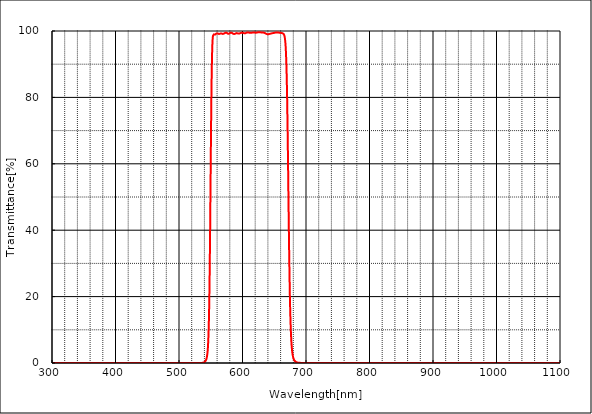
| Category | T% at AOI 0 deg |
|---|---|
| 1100.0 | 0.002 |
| 1099.5 | 0 |
| 1099.0 | 0.001 |
| 1098.5 | 0.002 |
| 1098.0 | 0.001 |
| 1097.5 | 0.001 |
| 1097.0 | 0.002 |
| 1096.5 | 0.001 |
| 1096.0 | 0.002 |
| 1095.5 | 0.003 |
| 1095.0 | 0.002 |
| 1094.5 | 0.002 |
| 1094.0 | 0.001 |
| 1093.5 | 0.002 |
| 1093.0 | 0.002 |
| 1092.5 | 0 |
| 1092.0 | 0.002 |
| 1091.5 | 0.001 |
| 1091.0 | 0.001 |
| 1090.5 | 0.001 |
| 1090.0 | 0.002 |
| 1089.5 | 0 |
| 1089.0 | 0.002 |
| 1088.5 | 0.001 |
| 1088.0 | 0 |
| 1087.5 | 0.001 |
| 1087.0 | 0 |
| 1086.5 | 0 |
| 1086.0 | 0.002 |
| 1085.5 | 0.002 |
| 1085.0 | 0 |
| 1084.5 | -0.001 |
| 1084.0 | 0.001 |
| 1083.5 | 0.001 |
| 1083.0 | 0 |
| 1082.5 | 0.001 |
| 1082.0 | 0 |
| 1081.5 | 0 |
| 1081.0 | 0.001 |
| 1080.5 | -0.001 |
| 1080.0 | 0 |
| 1079.5 | 0.001 |
| 1079.0 | 0 |
| 1078.5 | 0 |
| 1078.0 | 0.001 |
| 1077.5 | 0 |
| 1077.0 | 0 |
| 1076.5 | 0 |
| 1076.0 | -0.001 |
| 1075.5 | 0 |
| 1075.0 | -0.001 |
| 1074.5 | 0 |
| 1074.0 | 0 |
| 1073.5 | 0 |
| 1073.0 | 0.001 |
| 1072.5 | 0.001 |
| 1072.0 | 0.001 |
| 1071.5 | 0 |
| 1071.0 | 0 |
| 1070.5 | 0 |
| 1070.0 | 0.001 |
| 1069.5 | 0.001 |
| 1069.0 | 0 |
| 1068.5 | -0.001 |
| 1068.0 | 0.001 |
| 1067.5 | 0 |
| 1067.0 | 0 |
| 1066.5 | 0.002 |
| 1066.0 | 0 |
| 1065.5 | 0 |
| 1065.0 | -0.001 |
| 1064.5 | 0.001 |
| 1064.0 | 0.001 |
| 1063.5 | 0 |
| 1063.0 | 0 |
| 1062.5 | -0.001 |
| 1062.0 | 0 |
| 1061.5 | 0 |
| 1061.0 | 0 |
| 1060.5 | 0 |
| 1060.0 | 0.001 |
| 1059.5 | -0.001 |
| 1059.0 | -0.001 |
| 1058.5 | 0 |
| 1058.0 | 0 |
| 1057.5 | 0.001 |
| 1057.0 | 0.002 |
| 1056.5 | 0.001 |
| 1056.0 | 0.002 |
| 1055.5 | 0.001 |
| 1055.0 | 0.002 |
| 1054.5 | 0.001 |
| 1054.0 | 0.003 |
| 1053.5 | 0 |
| 1053.0 | 0.001 |
| 1052.5 | 0.002 |
| 1052.0 | -0.001 |
| 1051.5 | 0 |
| 1051.0 | 0 |
| 1050.5 | 0.001 |
| 1050.0 | -0.001 |
| 1049.5 | 0 |
| 1049.0 | 0.001 |
| 1048.5 | 0.001 |
| 1048.0 | 0 |
| 1047.5 | 0 |
| 1047.0 | 0 |
| 1046.5 | 0.001 |
| 1046.0 | 0.001 |
| 1045.5 | 0.001 |
| 1045.0 | 0.001 |
| 1044.5 | 0.001 |
| 1044.0 | 0.001 |
| 1043.5 | 0.001 |
| 1043.0 | 0 |
| 1042.5 | 0 |
| 1042.0 | 0.001 |
| 1041.5 | 0 |
| 1041.0 | 0 |
| 1040.5 | 0 |
| 1040.0 | 0 |
| 1039.5 | 0.001 |
| 1039.0 | 0 |
| 1038.5 | 0 |
| 1038.0 | 0 |
| 1037.5 | -0.001 |
| 1037.0 | 0 |
| 1036.5 | 0.001 |
| 1036.0 | 0 |
| 1035.5 | 0 |
| 1035.0 | -0.001 |
| 1034.5 | -0.001 |
| 1034.0 | 0 |
| 1033.5 | 0 |
| 1033.0 | 0 |
| 1032.5 | 0 |
| 1032.0 | 0 |
| 1031.5 | 0 |
| 1031.0 | 0 |
| 1030.5 | 0 |
| 1030.0 | 0 |
| 1029.5 | 0.001 |
| 1029.0 | -0.001 |
| 1028.5 | 0 |
| 1028.0 | 0.001 |
| 1027.5 | 0.001 |
| 1027.0 | 0 |
| 1026.5 | 0 |
| 1026.0 | 0.001 |
| 1025.5 | 0 |
| 1025.0 | 0 |
| 1024.5 | 0.001 |
| 1024.0 | 0 |
| 1023.5 | 0.001 |
| 1023.0 | 0 |
| 1022.5 | -0.001 |
| 1022.0 | 0.001 |
| 1021.5 | 0 |
| 1021.0 | 0 |
| 1020.5 | -0.001 |
| 1020.0 | 0.001 |
| 1019.5 | 0.001 |
| 1019.0 | 0 |
| 1018.5 | 0 |
| 1018.0 | 0 |
| 1017.5 | 0 |
| 1017.0 | 0.001 |
| 1016.5 | 0.001 |
| 1016.0 | 0 |
| 1015.5 | -0.001 |
| 1015.0 | 0.001 |
| 1014.5 | 0.001 |
| 1014.0 | 0 |
| 1013.5 | 0 |
| 1013.0 | 0.001 |
| 1012.5 | 0 |
| 1012.0 | 0 |
| 1011.5 | 0.001 |
| 1011.0 | 0.001 |
| 1010.5 | -0.001 |
| 1010.0 | 0.001 |
| 1009.5 | 0.001 |
| 1009.0 | -0.001 |
| 1008.5 | 0 |
| 1008.0 | 0 |
| 1007.5 | 0 |
| 1007.0 | 0 |
| 1006.5 | 0.001 |
| 1006.0 | 0 |
| 1005.5 | 0 |
| 1005.0 | 0 |
| 1004.5 | 0.001 |
| 1004.0 | 0 |
| 1003.5 | 0 |
| 1003.0 | 0 |
| 1002.5 | 0 |
| 1002.0 | 0.001 |
| 1001.5 | -0.001 |
| 1001.0 | -0.001 |
| 1000.5 | 0.001 |
| 1000.0 | 0.001 |
| 999.5 | 0.001 |
| 999.0 | 0.001 |
| 998.5 | 0 |
| 998.0 | 0 |
| 997.5 | 0.001 |
| 997.0 | 0 |
| 996.5 | 0.001 |
| 996.0 | 0 |
| 995.5 | 0 |
| 995.0 | 0 |
| 994.5 | 0.001 |
| 994.0 | 0 |
| 993.5 | -0.001 |
| 993.0 | 0 |
| 992.5 | 0 |
| 992.0 | 0.001 |
| 991.5 | 0 |
| 991.0 | 0.001 |
| 990.5 | 0.001 |
| 990.0 | 0.001 |
| 989.5 | 0 |
| 989.0 | 0 |
| 988.5 | 0.001 |
| 988.0 | -0.001 |
| 987.5 | 0.002 |
| 987.0 | 0.002 |
| 986.5 | -0.002 |
| 986.0 | 0 |
| 985.5 | 0 |
| 985.0 | 0 |
| 984.5 | 0 |
| 984.0 | 0 |
| 983.5 | 0.001 |
| 983.0 | 0 |
| 982.5 | 0 |
| 982.0 | 0 |
| 981.5 | 0 |
| 981.0 | -0.001 |
| 980.5 | 0 |
| 980.0 | 0 |
| 979.5 | 0 |
| 979.0 | 0 |
| 978.5 | 0.001 |
| 978.0 | 0 |
| 977.5 | 0 |
| 977.0 | -0.001 |
| 976.5 | -0.001 |
| 976.0 | 0 |
| 975.5 | 0.001 |
| 975.0 | 0.001 |
| 974.5 | 0.001 |
| 974.0 | 0.001 |
| 973.5 | 0 |
| 973.0 | 0.001 |
| 972.5 | 0 |
| 972.0 | 0 |
| 971.5 | 0 |
| 971.0 | -0.001 |
| 970.5 | 0 |
| 970.0 | 0 |
| 969.5 | 0 |
| 969.0 | 0.002 |
| 968.5 | 0 |
| 968.0 | 0 |
| 967.5 | -0.001 |
| 967.0 | 0 |
| 966.5 | 0.001 |
| 966.0 | 0 |
| 965.5 | 0 |
| 965.0 | 0 |
| 964.5 | 0 |
| 964.0 | 0.002 |
| 963.5 | -0.001 |
| 963.0 | -0.001 |
| 962.5 | 0 |
| 962.0 | 0.001 |
| 961.5 | 0 |
| 961.0 | 0.001 |
| 960.5 | 0 |
| 960.0 | 0.002 |
| 959.5 | 0 |
| 959.0 | 0.002 |
| 958.5 | 0 |
| 958.0 | 0 |
| 957.5 | 0 |
| 957.0 | 0 |
| 956.5 | -0.001 |
| 956.0 | 0 |
| 955.5 | 0 |
| 955.0 | -0.001 |
| 954.5 | -0.001 |
| 954.0 | 0.001 |
| 953.5 | 0 |
| 953.0 | 0.002 |
| 952.5 | 0 |
| 952.0 | 0 |
| 951.5 | 0 |
| 951.0 | 0 |
| 950.5 | 0 |
| 950.0 | 0 |
| 949.5 | -0.001 |
| 949.0 | 0.001 |
| 948.5 | 0 |
| 948.0 | 0.001 |
| 947.5 | 0 |
| 947.0 | 0 |
| 946.5 | -0.001 |
| 946.0 | 0.001 |
| 945.5 | 0 |
| 945.0 | -0.001 |
| 944.5 | -0.001 |
| 944.0 | -0.001 |
| 943.5 | 0 |
| 943.0 | 0 |
| 942.5 | 0.001 |
| 942.0 | 0.001 |
| 941.5 | -0.001 |
| 941.0 | -0.001 |
| 940.5 | 0 |
| 940.0 | 0.002 |
| 939.5 | 0.001 |
| 939.0 | 0 |
| 938.5 | 0.001 |
| 938.0 | 0.002 |
| 937.5 | 0.001 |
| 937.0 | 0.001 |
| 936.5 | 0.001 |
| 936.0 | 0 |
| 935.5 | 0 |
| 935.0 | -0.001 |
| 934.5 | 0.001 |
| 934.0 | 0 |
| 933.5 | 0 |
| 933.0 | -0.001 |
| 932.5 | 0.001 |
| 932.0 | 0 |
| 931.5 | -0.001 |
| 931.0 | 0 |
| 930.5 | 0.002 |
| 930.0 | 0.001 |
| 929.5 | 0 |
| 929.0 | 0.001 |
| 928.5 | 0 |
| 928.0 | 0.001 |
| 927.5 | 0 |
| 927.0 | 0 |
| 926.5 | 0 |
| 926.0 | -0.001 |
| 925.5 | 0 |
| 925.0 | 0.001 |
| 924.5 | 0.001 |
| 924.0 | 0.001 |
| 923.5 | 0.001 |
| 923.0 | 0 |
| 922.5 | 0 |
| 922.0 | 0.001 |
| 921.5 | 0 |
| 921.0 | 0.001 |
| 920.5 | 0 |
| 920.0 | 0 |
| 919.5 | -0.001 |
| 919.0 | 0.001 |
| 918.5 | 0 |
| 918.0 | 0.001 |
| 917.5 | 0.001 |
| 917.0 | 0.001 |
| 916.5 | 0.001 |
| 916.0 | 0.002 |
| 915.5 | 0.001 |
| 915.0 | 0 |
| 914.5 | 0 |
| 914.0 | 0 |
| 913.5 | 0.001 |
| 913.0 | 0.001 |
| 912.5 | 0.001 |
| 912.0 | 0.001 |
| 911.5 | 0.001 |
| 911.0 | 0.002 |
| 910.5 | 0 |
| 910.0 | 0 |
| 909.5 | 0 |
| 909.0 | 0 |
| 908.5 | 0.001 |
| 908.0 | 0 |
| 907.5 | 0.002 |
| 907.0 | 0 |
| 906.5 | 0.001 |
| 906.0 | 0.001 |
| 905.5 | 0 |
| 905.0 | 0 |
| 904.5 | 0.001 |
| 904.0 | 0 |
| 903.5 | 0 |
| 903.0 | 0.001 |
| 902.5 | 0 |
| 902.0 | 0.001 |
| 901.5 | 0 |
| 901.0 | 0 |
| 900.5 | 0 |
| 900.0 | -0.001 |
| 899.5 | -0.001 |
| 899.0 | 0 |
| 898.5 | 0.001 |
| 898.0 | 0 |
| 897.5 | 0 |
| 897.0 | 0.001 |
| 896.5 | 0.001 |
| 896.0 | 0 |
| 895.5 | 0 |
| 895.0 | 0 |
| 894.5 | 0 |
| 894.0 | -0.001 |
| 893.5 | 0 |
| 893.0 | 0 |
| 892.5 | 0.001 |
| 892.0 | 0.002 |
| 891.5 | -0.001 |
| 891.0 | 0.001 |
| 890.5 | 0 |
| 890.0 | -0.001 |
| 889.5 | 0 |
| 889.0 | 0.001 |
| 888.5 | 0 |
| 888.0 | 0.002 |
| 887.5 | 0 |
| 887.0 | 0 |
| 886.5 | 0 |
| 886.0 | 0.002 |
| 885.5 | 0 |
| 885.0 | 0 |
| 884.5 | 0 |
| 884.0 | 0.001 |
| 883.5 | 0.001 |
| 883.0 | -0.001 |
| 882.5 | 0 |
| 882.0 | 0 |
| 881.5 | 0 |
| 881.0 | 0 |
| 880.5 | 0 |
| 880.0 | 0.002 |
| 879.5 | -0.001 |
| 879.0 | 0 |
| 878.5 | 0.001 |
| 878.0 | 0 |
| 877.5 | 0 |
| 877.0 | 0 |
| 876.5 | -0.001 |
| 876.0 | -0.001 |
| 875.5 | 0.001 |
| 875.0 | 0.001 |
| 874.5 | 0 |
| 874.0 | 0 |
| 873.5 | -0.001 |
| 873.0 | 0 |
| 872.5 | 0 |
| 872.0 | 0.001 |
| 871.5 | 0 |
| 871.0 | 0.001 |
| 870.5 | 0 |
| 870.0 | 0 |
| 869.5 | 0 |
| 869.0 | -0.002 |
| 868.5 | -0.001 |
| 868.0 | -0.001 |
| 867.5 | 0 |
| 867.0 | 0 |
| 866.5 | 0 |
| 866.0 | 0 |
| 865.5 | 0 |
| 865.0 | 0 |
| 864.5 | 0.001 |
| 864.0 | 0.001 |
| 863.5 | 0.001 |
| 863.0 | 0 |
| 862.5 | 0 |
| 862.0 | -0.001 |
| 861.5 | 0 |
| 861.0 | 0 |
| 860.5 | 0 |
| 860.0 | 0 |
| 859.5 | 0 |
| 859.0 | 0.001 |
| 858.5 | 0 |
| 858.0 | 0.001 |
| 857.5 | -0.001 |
| 857.0 | 0 |
| 856.5 | 0.001 |
| 856.0 | 0 |
| 855.5 | 0 |
| 855.0 | 0 |
| 854.5 | -0.001 |
| 854.0 | -0.001 |
| 853.5 | 0.001 |
| 853.0 | 0 |
| 852.5 | 0.001 |
| 852.0 | 0.001 |
| 851.5 | 0 |
| 851.0 | 0.001 |
| 850.5 | -0.001 |
| 850.0 | 0.001 |
| 849.5 | 0 |
| 849.0 | 0 |
| 848.5 | 0.001 |
| 848.0 | 0 |
| 847.5 | 0 |
| 847.0 | 0 |
| 846.5 | 0 |
| 846.0 | 0 |
| 845.5 | 0 |
| 845.0 | 0 |
| 844.5 | 0 |
| 844.0 | 0 |
| 843.5 | 0 |
| 843.0 | 0 |
| 842.5 | 0 |
| 842.0 | 0 |
| 841.5 | 0 |
| 841.0 | 0 |
| 840.5 | 0 |
| 840.0 | 0 |
| 839.5 | 0 |
| 839.0 | 0 |
| 838.5 | 0 |
| 838.0 | 0 |
| 837.5 | 0 |
| 837.0 | 0 |
| 836.5 | 0 |
| 836.0 | 0 |
| 835.5 | 0 |
| 835.0 | 0 |
| 834.5 | 0 |
| 834.0 | 0 |
| 833.5 | 0 |
| 833.0 | 0 |
| 832.5 | -0.001 |
| 832.0 | 0 |
| 831.5 | 0 |
| 831.0 | 0 |
| 830.5 | 0 |
| 830.0 | 0 |
| 829.5 | 0 |
| 829.0 | 0 |
| 828.5 | 0 |
| 828.0 | 0 |
| 827.5 | 0 |
| 827.0 | 0 |
| 826.5 | 0 |
| 826.0 | 0 |
| 825.5 | 0.001 |
| 825.0 | 0 |
| 824.5 | 0 |
| 824.0 | 0 |
| 823.5 | 0 |
| 823.0 | 0 |
| 822.5 | 0 |
| 822.0 | 0 |
| 821.5 | 0 |
| 821.0 | 0 |
| 820.5 | 0 |
| 820.0 | 0 |
| 819.5 | 0 |
| 819.0 | 0 |
| 818.5 | 0 |
| 818.0 | 0 |
| 817.5 | 0 |
| 817.0 | 0 |
| 816.5 | 0 |
| 816.0 | 0 |
| 815.5 | 0 |
| 815.0 | 0 |
| 814.5 | 0 |
| 814.0 | 0 |
| 813.5 | 0 |
| 813.0 | 0 |
| 812.5 | 0 |
| 812.0 | 0 |
| 811.5 | 0 |
| 811.0 | 0 |
| 810.5 | 0 |
| 810.0 | 0 |
| 809.5 | 0 |
| 809.0 | -0.001 |
| 808.5 | 0 |
| 808.0 | 0 |
| 807.5 | 0 |
| 807.0 | 0 |
| 806.5 | 0 |
| 806.0 | 0 |
| 805.5 | 0 |
| 805.0 | 0 |
| 804.5 | 0 |
| 804.0 | 0 |
| 803.5 | 0 |
| 803.0 | 0 |
| 802.5 | 0 |
| 802.0 | 0 |
| 801.5 | 0 |
| 801.0 | 0 |
| 800.5 | 0 |
| 800.0 | 0 |
| 799.5 | 0 |
| 799.0 | 0 |
| 798.5 | 0 |
| 798.0 | 0 |
| 797.5 | 0 |
| 797.0 | 0 |
| 796.5 | 0 |
| 796.0 | 0 |
| 795.5 | 0 |
| 795.0 | 0 |
| 794.5 | 0 |
| 794.0 | 0 |
| 793.5 | 0 |
| 793.0 | 0 |
| 792.5 | 0 |
| 792.0 | 0 |
| 791.5 | 0 |
| 791.0 | 0 |
| 790.5 | 0 |
| 790.0 | 0 |
| 789.5 | 0 |
| 789.0 | 0 |
| 788.5 | 0 |
| 788.0 | 0 |
| 787.5 | 0 |
| 787.0 | 0 |
| 786.5 | 0 |
| 786.0 | 0 |
| 785.5 | 0 |
| 785.0 | 0 |
| 784.5 | 0 |
| 784.0 | 0 |
| 783.5 | 0 |
| 783.0 | 0 |
| 782.5 | 0 |
| 782.0 | 0.001 |
| 781.5 | 0 |
| 781.0 | 0 |
| 780.5 | 0 |
| 780.0 | 0 |
| 779.5 | 0 |
| 779.0 | 0 |
| 778.5 | 0 |
| 778.0 | 0 |
| 777.5 | 0 |
| 777.0 | 0 |
| 776.5 | 0 |
| 776.0 | 0 |
| 775.5 | 0 |
| 775.0 | 0 |
| 774.5 | 0 |
| 774.0 | 0 |
| 773.5 | 0 |
| 773.0 | 0 |
| 772.5 | 0 |
| 772.0 | 0 |
| 771.5 | 0 |
| 771.0 | 0 |
| 770.5 | 0 |
| 770.0 | 0 |
| 769.5 | 0 |
| 769.0 | 0 |
| 768.5 | 0 |
| 768.0 | 0 |
| 767.5 | 0 |
| 767.0 | 0 |
| 766.5 | 0 |
| 766.0 | 0 |
| 765.5 | 0 |
| 765.0 | 0 |
| 764.5 | 0 |
| 764.0 | 0 |
| 763.5 | 0 |
| 763.0 | 0 |
| 762.5 | 0 |
| 762.0 | 0 |
| 761.5 | 0 |
| 761.0 | 0 |
| 760.5 | 0 |
| 760.0 | 0 |
| 759.5 | 0 |
| 759.0 | 0 |
| 758.5 | 0 |
| 758.0 | 0 |
| 757.5 | 0 |
| 757.0 | 0 |
| 756.5 | 0 |
| 756.0 | 0 |
| 755.5 | 0 |
| 755.0 | 0 |
| 754.5 | 0 |
| 754.0 | 0 |
| 753.5 | 0 |
| 753.0 | 0 |
| 752.5 | 0 |
| 752.0 | 0 |
| 751.5 | 0 |
| 751.0 | 0 |
| 750.5 | 0 |
| 750.0 | 0 |
| 749.5 | 0 |
| 749.0 | 0 |
| 748.5 | 0 |
| 748.0 | 0 |
| 747.5 | 0 |
| 747.0 | 0 |
| 746.5 | 0 |
| 746.0 | 0 |
| 745.5 | 0 |
| 745.0 | 0 |
| 744.5 | 0 |
| 744.0 | 0 |
| 743.5 | 0 |
| 743.0 | 0 |
| 742.5 | 0 |
| 742.0 | 0 |
| 741.5 | 0 |
| 741.0 | 0 |
| 740.5 | 0 |
| 740.0 | 0 |
| 739.5 | 0 |
| 739.0 | 0 |
| 738.5 | 0 |
| 738.0 | 0 |
| 737.5 | 0 |
| 737.0 | 0 |
| 736.5 | 0 |
| 736.0 | 0 |
| 735.5 | 0 |
| 735.0 | 0 |
| 734.5 | 0 |
| 734.0 | 0 |
| 733.5 | 0 |
| 733.0 | 0 |
| 732.5 | 0 |
| 732.0 | 0 |
| 731.5 | 0 |
| 731.0 | 0 |
| 730.5 | 0 |
| 730.0 | 0 |
| 729.5 | 0 |
| 729.0 | 0 |
| 728.5 | 0 |
| 728.0 | 0 |
| 727.5 | 0 |
| 727.0 | 0 |
| 726.5 | 0 |
| 726.0 | 0 |
| 725.5 | 0 |
| 725.0 | 0 |
| 724.5 | 0 |
| 724.0 | 0 |
| 723.5 | 0 |
| 723.0 | 0 |
| 722.5 | 0 |
| 722.0 | 0 |
| 721.5 | 0 |
| 721.0 | 0 |
| 720.5 | 0 |
| 720.0 | 0 |
| 719.5 | 0 |
| 719.0 | 0 |
| 718.5 | 0 |
| 718.0 | 0 |
| 717.5 | 0 |
| 717.0 | 0 |
| 716.5 | 0 |
| 716.0 | 0 |
| 715.5 | 0 |
| 715.0 | 0 |
| 714.5 | 0 |
| 714.0 | 0 |
| 713.5 | 0 |
| 713.0 | 0 |
| 712.5 | 0 |
| 712.0 | 0 |
| 711.5 | 0 |
| 711.0 | 0.001 |
| 710.5 | 0.001 |
| 710.0 | 0 |
| 709.5 | 0.001 |
| 709.0 | 0.001 |
| 708.5 | 0 |
| 708.0 | 0.001 |
| 707.5 | 0.001 |
| 707.0 | 0.001 |
| 706.5 | 0.001 |
| 706.0 | 0.001 |
| 705.5 | 0.002 |
| 705.0 | 0.001 |
| 704.5 | 0.002 |
| 704.0 | 0.002 |
| 703.5 | 0.002 |
| 703.0 | 0.002 |
| 702.5 | 0.003 |
| 702.0 | 0.003 |
| 701.5 | 0.003 |
| 701.0 | 0.003 |
| 700.5 | 0.004 |
| 700.0 | 0.004 |
| 699.5 | 0.005 |
| 699.0 | 0.006 |
| 698.5 | 0.006 |
| 698.0 | 0.007 |
| 697.5 | 0.008 |
| 697.0 | 0.009 |
| 696.5 | 0.01 |
| 696.0 | 0.011 |
| 695.5 | 0.012 |
| 695.0 | 0.014 |
| 694.5 | 0.016 |
| 694.0 | 0.018 |
| 693.5 | 0.02 |
| 693.0 | 0.023 |
| 692.5 | 0.026 |
| 692.0 | 0.029 |
| 691.5 | 0.034 |
| 691.0 | 0.038 |
| 690.5 | 0.044 |
| 690.0 | 0.05 |
| 689.5 | 0.058 |
| 689.0 | 0.066 |
| 688.5 | 0.076 |
| 688.0 | 0.089 |
| 687.5 | 0.102 |
| 687.0 | 0.12 |
| 686.5 | 0.139 |
| 686.0 | 0.164 |
| 685.5 | 0.193 |
| 685.0 | 0.228 |
| 684.5 | 0.27 |
| 684.0 | 0.321 |
| 683.5 | 0.386 |
| 683.0 | 0.463 |
| 682.5 | 0.558 |
| 682.0 | 0.681 |
| 681.5 | 0.829 |
| 681.0 | 1.016 |
| 680.5 | 1.256 |
| 680.0 | 1.557 |
| 679.5 | 1.942 |
| 679.0 | 2.435 |
| 678.5 | 3.072 |
| 678.0 | 3.89 |
| 677.5 | 4.945 |
| 677.0 | 6.321 |
| 676.5 | 8.079 |
| 676.0 | 10.327 |
| 675.5 | 13.276 |
| 675.0 | 16.861 |
| 674.5 | 21.288 |
| 674.0 | 26.765 |
| 673.5 | 33.029 |
| 673.0 | 40.066 |
| 672.5 | 47.777 |
| 672.0 | 55.711 |
| 671.5 | 63.404 |
| 671.0 | 70.695 |
| 670.5 | 77.181 |
| 670.0 | 82.684 |
| 669.5 | 87.153 |
| 669.0 | 90.662 |
| 668.5 | 93.273 |
| 668.0 | 95.164 |
| 667.5 | 96.547 |
| 667.0 | 97.479 |
| 666.5 | 98.143 |
| 666.0 | 98.588 |
| 665.5 | 98.85 |
| 665.0 | 99.045 |
| 664.5 | 99.171 |
| 664.0 | 99.259 |
| 663.5 | 99.304 |
| 663.0 | 99.346 |
| 662.5 | 99.37 |
| 662.0 | 99.387 |
| 661.5 | 99.396 |
| 661.0 | 99.415 |
| 660.5 | 99.428 |
| 660.0 | 99.424 |
| 659.5 | 99.445 |
| 659.0 | 99.455 |
| 658.5 | 99.468 |
| 658.0 | 99.482 |
| 657.5 | 99.489 |
| 657.0 | 99.513 |
| 656.5 | 99.515 |
| 656.0 | 99.535 |
| 655.5 | 99.546 |
| 655.0 | 99.551 |
| 654.5 | 99.543 |
| 654.0 | 99.548 |
| 653.5 | 99.555 |
| 653.0 | 99.549 |
| 652.5 | 99.539 |
| 652.0 | 99.53 |
| 651.5 | 99.51 |
| 651.0 | 99.493 |
| 650.5 | 99.482 |
| 650.0 | 99.442 |
| 649.5 | 99.431 |
| 649.0 | 99.406 |
| 648.5 | 99.373 |
| 648.0 | 99.364 |
| 647.5 | 99.334 |
| 647.0 | 99.337 |
| 646.5 | 99.291 |
| 646.0 | 99.28 |
| 645.5 | 99.276 |
| 645.0 | 99.245 |
| 644.5 | 99.229 |
| 644.0 | 99.2 |
| 643.5 | 99.182 |
| 643.0 | 99.156 |
| 642.5 | 99.121 |
| 642.0 | 99.1 |
| 641.5 | 99.064 |
| 641.0 | 99.043 |
| 640.5 | 99.036 |
| 640.0 | 99.038 |
| 639.5 | 99.029 |
| 639.0 | 99.047 |
| 638.5 | 99.071 |
| 638.0 | 99.091 |
| 637.5 | 99.132 |
| 637.0 | 99.189 |
| 636.5 | 99.234 |
| 636.0 | 99.296 |
| 635.5 | 99.337 |
| 635.0 | 99.398 |
| 634.5 | 99.419 |
| 634.0 | 99.466 |
| 633.5 | 99.502 |
| 633.0 | 99.527 |
| 632.5 | 99.541 |
| 632.0 | 99.55 |
| 631.5 | 99.547 |
| 631.0 | 99.554 |
| 630.5 | 99.561 |
| 630.0 | 99.557 |
| 629.5 | 99.577 |
| 629.0 | 99.578 |
| 628.5 | 99.573 |
| 628.0 | 99.594 |
| 627.5 | 99.596 |
| 627.0 | 99.619 |
| 626.5 | 99.612 |
| 626.0 | 99.632 |
| 625.5 | 99.633 |
| 625.0 | 99.642 |
| 624.5 | 99.621 |
| 624.0 | 99.606 |
| 623.5 | 99.568 |
| 623.0 | 99.549 |
| 622.5 | 99.527 |
| 622.0 | 99.528 |
| 621.5 | 99.507 |
| 621.0 | 99.474 |
| 620.5 | 99.48 |
| 620.0 | 99.488 |
| 619.5 | 99.518 |
| 619.0 | 99.526 |
| 618.5 | 99.505 |
| 618.0 | 99.521 |
| 617.5 | 99.551 |
| 617.0 | 99.54 |
| 616.5 | 99.539 |
| 616.0 | 99.53 |
| 615.5 | 99.522 |
| 615.0 | 99.503 |
| 614.5 | 99.49 |
| 614.0 | 99.474 |
| 613.5 | 99.48 |
| 613.0 | 99.462 |
| 612.5 | 99.444 |
| 612.0 | 99.457 |
| 611.5 | 99.458 |
| 611.0 | 99.489 |
| 610.5 | 99.545 |
| 610.0 | 99.589 |
| 609.5 | 99.581 |
| 609.0 | 99.576 |
| 608.5 | 99.601 |
| 608.0 | 99.595 |
| 607.5 | 99.574 |
| 607.0 | 99.554 |
| 606.5 | 99.498 |
| 606.0 | 99.469 |
| 605.5 | 99.424 |
| 605.0 | 99.366 |
| 604.5 | 99.335 |
| 604.0 | 99.301 |
| 603.5 | 99.3 |
| 603.0 | 99.294 |
| 602.5 | 99.318 |
| 602.0 | 99.349 |
| 601.5 | 99.384 |
| 601.0 | 99.438 |
| 600.5 | 99.466 |
| 600.0 | 99.496 |
| 599.5 | 99.516 |
| 599.0 | 99.514 |
| 598.5 | 99.5 |
| 598.0 | 99.467 |
| 597.5 | 99.429 |
| 597.0 | 99.38 |
| 596.5 | 99.33 |
| 596.0 | 99.262 |
| 595.5 | 99.233 |
| 595.0 | 99.233 |
| 594.5 | 99.216 |
| 594.0 | 99.198 |
| 593.5 | 99.205 |
| 593.0 | 99.247 |
| 592.5 | 99.276 |
| 592.0 | 99.351 |
| 591.5 | 99.363 |
| 591.0 | 99.37 |
| 590.5 | 99.357 |
| 590.0 | 99.348 |
| 589.5 | 99.297 |
| 589.0 | 99.248 |
| 588.5 | 99.221 |
| 588.0 | 99.16 |
| 587.5 | 99.099 |
| 587.0 | 99.083 |
| 586.5 | 99.106 |
| 586.0 | 99.113 |
| 585.5 | 99.13 |
| 585.0 | 99.197 |
| 584.5 | 99.267 |
| 584.0 | 99.343 |
| 583.5 | 99.409 |
| 583.0 | 99.473 |
| 582.5 | 99.519 |
| 582.0 | 99.518 |
| 581.5 | 99.513 |
| 581.0 | 99.469 |
| 580.5 | 99.436 |
| 580.0 | 99.362 |
| 579.5 | 99.276 |
| 579.0 | 99.206 |
| 578.5 | 99.173 |
| 578.0 | 99.155 |
| 577.5 | 99.156 |
| 577.0 | 99.189 |
| 576.5 | 99.239 |
| 576.0 | 99.288 |
| 575.5 | 99.384 |
| 575.0 | 99.463 |
| 574.5 | 99.473 |
| 574.0 | 99.49 |
| 573.5 | 99.479 |
| 573.0 | 99.449 |
| 572.5 | 99.412 |
| 572.0 | 99.361 |
| 571.5 | 99.287 |
| 571.0 | 99.239 |
| 570.5 | 99.173 |
| 570.0 | 99.154 |
| 569.5 | 99.118 |
| 569.0 | 99.124 |
| 568.5 | 99.145 |
| 568.0 | 99.179 |
| 567.5 | 99.218 |
| 567.0 | 99.236 |
| 566.5 | 99.251 |
| 566.0 | 99.255 |
| 565.5 | 99.239 |
| 565.0 | 99.221 |
| 564.5 | 99.178 |
| 564.0 | 99.14 |
| 563.5 | 99.127 |
| 563.0 | 99.105 |
| 562.5 | 99.129 |
| 562.0 | 99.144 |
| 561.5 | 99.183 |
| 561.0 | 99.251 |
| 560.5 | 99.273 |
| 560.0 | 99.308 |
| 559.5 | 99.301 |
| 559.0 | 99.257 |
| 558.5 | 99.21 |
| 558.0 | 99.125 |
| 557.5 | 99.024 |
| 557.0 | 98.945 |
| 556.5 | 98.887 |
| 556.0 | 98.879 |
| 555.5 | 98.914 |
| 555.0 | 98.981 |
| 554.5 | 99.028 |
| 554.0 | 98.957 |
| 553.5 | 98.578 |
| 553.0 | 97.606 |
| 552.5 | 95.722 |
| 552.0 | 92.429 |
| 551.5 | 87.213 |
| 551.0 | 80.162 |
| 550.5 | 71.219 |
| 550.0 | 60.915 |
| 549.5 | 50.179 |
| 549.0 | 39.731 |
| 548.5 | 30.509 |
| 548.0 | 22.743 |
| 547.5 | 16.677 |
| 547.0 | 12.122 |
| 546.5 | 8.715 |
| 546.0 | 6.32 |
| 545.5 | 4.628 |
| 545.0 | 3.379 |
| 544.5 | 2.531 |
| 544.0 | 1.91 |
| 543.5 | 1.447 |
| 543.0 | 1.112 |
| 542.5 | 0.861 |
| 542.0 | 0.666 |
| 541.5 | 0.518 |
| 541.0 | 0.404 |
| 540.5 | 0.313 |
| 540.0 | 0.242 |
| 539.5 | 0.187 |
| 539.0 | 0.144 |
| 538.5 | 0.11 |
| 538.0 | 0.084 |
| 537.5 | 0.064 |
| 537.0 | 0.049 |
| 536.5 | 0.038 |
| 536.0 | 0.029 |
| 535.5 | 0.023 |
| 535.0 | 0.017 |
| 534.5 | 0.014 |
| 534.0 | 0.011 |
| 533.5 | 0.009 |
| 533.0 | 0.007 |
| 532.5 | 0.006 |
| 532.0 | 0.005 |
| 531.5 | 0.004 |
| 531.0 | 0.004 |
| 530.5 | 0.003 |
| 530.0 | 0.003 |
| 529.5 | 0.003 |
| 529.0 | 0.002 |
| 528.5 | 0.002 |
| 528.0 | 0.002 |
| 527.5 | 0.002 |
| 527.0 | 0.001 |
| 526.5 | 0.001 |
| 526.0 | 0.001 |
| 525.5 | 0.001 |
| 525.0 | 0.001 |
| 524.5 | 0.001 |
| 524.0 | 0 |
| 523.5 | 0.001 |
| 523.0 | 0 |
| 522.5 | 0 |
| 522.0 | 0 |
| 521.5 | 0 |
| 521.0 | 0 |
| 520.5 | 0 |
| 520.0 | 0 |
| 519.5 | 0 |
| 519.0 | 0 |
| 518.5 | 0 |
| 518.0 | 0 |
| 517.5 | 0 |
| 517.0 | 0 |
| 516.5 | 0 |
| 516.0 | 0 |
| 515.5 | 0 |
| 515.0 | 0 |
| 514.5 | 0 |
| 514.0 | 0 |
| 513.5 | 0 |
| 513.0 | 0 |
| 512.5 | 0 |
| 512.0 | 0 |
| 511.5 | 0 |
| 511.0 | 0 |
| 510.5 | 0 |
| 510.0 | 0 |
| 509.5 | 0 |
| 509.0 | 0 |
| 508.5 | 0 |
| 508.0 | 0 |
| 507.5 | 0 |
| 507.0 | 0 |
| 506.5 | 0 |
| 506.0 | 0 |
| 505.5 | 0 |
| 505.0 | 0 |
| 504.5 | 0 |
| 504.0 | 0 |
| 503.5 | 0 |
| 503.0 | 0 |
| 502.5 | 0 |
| 502.0 | 0 |
| 501.5 | 0 |
| 501.0 | 0 |
| 500.5 | 0 |
| 500.0 | 0 |
| 499.5 | 0 |
| 499.0 | 0 |
| 498.5 | 0 |
| 498.0 | 0 |
| 497.5 | 0 |
| 497.0 | 0 |
| 496.5 | 0 |
| 496.0 | 0 |
| 495.5 | 0 |
| 495.0 | 0 |
| 494.5 | 0 |
| 494.0 | 0 |
| 493.5 | 0 |
| 493.0 | 0 |
| 492.5 | 0 |
| 492.0 | 0 |
| 491.5 | 0 |
| 491.0 | 0 |
| 490.5 | 0 |
| 490.0 | 0 |
| 489.5 | 0 |
| 489.0 | 0 |
| 488.5 | 0 |
| 488.0 | 0 |
| 487.5 | 0 |
| 487.0 | 0 |
| 486.5 | 0 |
| 486.0 | 0 |
| 485.5 | 0 |
| 485.0 | 0 |
| 484.5 | 0 |
| 484.0 | 0 |
| 483.5 | 0 |
| 483.0 | 0 |
| 482.5 | 0 |
| 482.0 | 0 |
| 481.5 | 0 |
| 481.0 | 0 |
| 480.5 | 0 |
| 480.0 | 0 |
| 479.5 | 0 |
| 479.0 | 0 |
| 478.5 | 0 |
| 478.0 | 0 |
| 477.5 | 0 |
| 477.0 | 0 |
| 476.5 | 0 |
| 476.0 | 0 |
| 475.5 | 0 |
| 475.0 | 0 |
| 474.5 | 0 |
| 474.0 | 0 |
| 473.5 | 0 |
| 473.0 | 0 |
| 472.5 | 0 |
| 472.0 | 0 |
| 471.5 | 0 |
| 471.0 | 0 |
| 470.5 | 0 |
| 470.0 | 0 |
| 469.5 | 0 |
| 469.0 | 0 |
| 468.5 | 0 |
| 468.0 | 0 |
| 467.5 | 0 |
| 467.0 | 0 |
| 466.5 | 0 |
| 466.0 | 0 |
| 465.5 | 0 |
| 465.0 | 0 |
| 464.5 | 0 |
| 464.0 | 0 |
| 463.5 | 0 |
| 463.0 | 0 |
| 462.5 | 0 |
| 462.0 | 0 |
| 461.5 | 0 |
| 461.0 | 0 |
| 460.5 | 0 |
| 460.0 | 0 |
| 459.5 | 0 |
| 459.0 | 0 |
| 458.5 | 0 |
| 458.0 | 0 |
| 457.5 | 0 |
| 457.0 | 0 |
| 456.5 | 0 |
| 456.0 | 0 |
| 455.5 | 0 |
| 455.0 | 0 |
| 454.5 | 0 |
| 454.0 | 0 |
| 453.5 | 0 |
| 453.0 | 0 |
| 452.5 | 0 |
| 452.0 | 0 |
| 451.5 | 0 |
| 451.0 | 0 |
| 450.5 | 0 |
| 450.0 | 0 |
| 449.5 | 0 |
| 449.0 | 0 |
| 448.5 | 0 |
| 448.0 | 0 |
| 447.5 | 0 |
| 447.0 | 0 |
| 446.5 | 0 |
| 446.0 | 0 |
| 445.5 | 0 |
| 445.0 | 0 |
| 444.5 | 0 |
| 444.0 | 0 |
| 443.5 | 0 |
| 443.0 | 0 |
| 442.5 | 0 |
| 442.0 | 0 |
| 441.5 | 0 |
| 441.0 | 0 |
| 440.5 | 0 |
| 440.0 | 0 |
| 439.5 | 0 |
| 439.0 | 0 |
| 438.5 | 0 |
| 438.0 | 0 |
| 437.5 | 0 |
| 437.0 | 0 |
| 436.5 | 0 |
| 436.0 | 0 |
| 435.5 | 0 |
| 435.0 | 0 |
| 434.5 | 0 |
| 434.0 | 0 |
| 433.5 | 0 |
| 433.0 | 0 |
| 432.5 | 0 |
| 432.0 | 0 |
| 431.5 | 0 |
| 431.0 | 0 |
| 430.5 | 0 |
| 430.0 | 0 |
| 429.5 | 0 |
| 429.0 | 0 |
| 428.5 | 0 |
| 428.0 | 0 |
| 427.5 | 0 |
| 427.0 | 0 |
| 426.5 | 0 |
| 426.0 | 0 |
| 425.5 | 0 |
| 425.0 | 0 |
| 424.5 | 0 |
| 424.0 | 0 |
| 423.5 | 0 |
| 423.0 | 0 |
| 422.5 | 0 |
| 422.0 | 0 |
| 421.5 | 0 |
| 421.0 | 0 |
| 420.5 | 0 |
| 420.0 | 0 |
| 419.5 | 0 |
| 419.0 | 0 |
| 418.5 | 0 |
| 418.0 | 0 |
| 417.5 | 0 |
| 417.0 | 0 |
| 416.5 | 0 |
| 416.0 | 0 |
| 415.5 | 0 |
| 415.0 | 0 |
| 414.5 | 0 |
| 414.0 | 0 |
| 413.5 | 0 |
| 413.0 | 0 |
| 412.5 | 0 |
| 412.0 | 0 |
| 411.5 | 0 |
| 411.0 | 0 |
| 410.5 | 0 |
| 410.0 | 0 |
| 409.5 | 0 |
| 409.0 | 0 |
| 408.5 | 0 |
| 408.0 | 0 |
| 407.5 | 0 |
| 407.0 | 0 |
| 406.5 | 0 |
| 406.0 | 0 |
| 405.5 | 0 |
| 405.0 | 0 |
| 404.5 | 0 |
| 404.0 | 0 |
| 403.5 | 0 |
| 403.0 | 0 |
| 402.5 | 0 |
| 402.0 | 0 |
| 401.5 | 0 |
| 401.0 | 0 |
| 400.5 | 0 |
| 400.0 | 0 |
| 399.5 | 0 |
| 399.0 | 0 |
| 398.5 | 0 |
| 398.0 | 0 |
| 397.5 | 0 |
| 397.0 | 0 |
| 396.5 | 0 |
| 396.0 | -0.001 |
| 395.5 | 0 |
| 395.0 | 0 |
| 394.5 | 0 |
| 394.0 | 0 |
| 393.5 | 0 |
| 393.0 | 0 |
| 392.5 | 0 |
| 392.0 | 0 |
| 391.5 | 0 |
| 391.0 | 0 |
| 390.5 | 0 |
| 390.0 | 0 |
| 389.5 | 0 |
| 389.0 | 0 |
| 388.5 | 0 |
| 388.0 | 0 |
| 387.5 | 0 |
| 387.0 | 0 |
| 386.5 | 0 |
| 386.0 | 0 |
| 385.5 | 0 |
| 385.0 | 0 |
| 384.5 | 0 |
| 384.0 | 0 |
| 383.5 | 0 |
| 383.0 | 0 |
| 382.5 | 0 |
| 382.0 | 0 |
| 381.5 | 0 |
| 381.0 | 0 |
| 380.5 | 0 |
| 380.0 | 0 |
| 379.5 | 0 |
| 379.0 | 0 |
| 378.5 | 0 |
| 378.0 | 0 |
| 377.5 | 0 |
| 377.0 | 0 |
| 376.5 | 0 |
| 376.0 | 0 |
| 375.5 | 0 |
| 375.0 | 0 |
| 374.5 | 0 |
| 374.0 | 0 |
| 373.5 | 0 |
| 373.0 | 0 |
| 372.5 | 0 |
| 372.0 | 0 |
| 371.5 | 0 |
| 371.0 | 0 |
| 370.5 | 0 |
| 370.0 | 0 |
| 369.5 | 0 |
| 369.0 | 0 |
| 368.5 | 0 |
| 368.0 | 0 |
| 367.5 | 0 |
| 367.0 | 0 |
| 366.5 | 0 |
| 366.0 | 0 |
| 365.5 | 0 |
| 365.0 | 0 |
| 364.5 | 0 |
| 364.0 | 0 |
| 363.5 | 0 |
| 363.0 | 0 |
| 362.5 | 0 |
| 362.0 | 0 |
| 361.5 | 0 |
| 361.0 | 0 |
| 360.5 | 0 |
| 360.0 | 0 |
| 359.5 | 0 |
| 359.0 | 0 |
| 358.5 | 0 |
| 358.0 | 0 |
| 357.5 | 0 |
| 357.0 | 0 |
| 356.5 | 0 |
| 356.0 | 0 |
| 355.5 | 0 |
| 355.0 | 0 |
| 354.5 | 0 |
| 354.0 | 0 |
| 353.5 | 0 |
| 353.0 | 0 |
| 352.5 | 0 |
| 352.0 | 0 |
| 351.5 | 0 |
| 351.0 | 0 |
| 350.5 | 0 |
| 350.0 | 0 |
| 349.5 | 0 |
| 349.0 | 0 |
| 348.5 | 0 |
| 348.0 | 0 |
| 347.5 | 0 |
| 347.0 | 0 |
| 346.5 | 0 |
| 346.0 | 0 |
| 345.5 | 0 |
| 345.0 | 0 |
| 344.5 | 0 |
| 344.0 | 0 |
| 343.5 | 0 |
| 343.0 | 0 |
| 342.5 | 0 |
| 342.0 | 0 |
| 341.5 | 0 |
| 341.0 | 0 |
| 340.5 | 0 |
| 340.0 | 0 |
| 339.5 | 0 |
| 339.0 | 0 |
| 338.5 | 0 |
| 338.0 | 0 |
| 337.5 | 0 |
| 337.0 | 0 |
| 336.5 | 0 |
| 336.0 | 0 |
| 335.5 | 0 |
| 335.0 | 0 |
| 334.5 | 0 |
| 334.0 | 0 |
| 333.5 | 0 |
| 333.0 | 0 |
| 332.5 | 0 |
| 332.0 | 0 |
| 331.5 | 0 |
| 331.0 | 0 |
| 330.5 | 0 |
| 330.0 | 0 |
| 329.5 | 0 |
| 329.0 | 0 |
| 328.5 | 0 |
| 328.0 | 0 |
| 327.5 | 0 |
| 327.0 | 0 |
| 326.5 | 0 |
| 326.0 | 0 |
| 325.5 | 0 |
| 325.0 | 0 |
| 324.5 | 0 |
| 324.0 | 0 |
| 323.5 | 0 |
| 323.0 | 0 |
| 322.5 | 0 |
| 322.0 | 0 |
| 321.5 | 0 |
| 321.0 | 0 |
| 320.5 | 0 |
| 320.0 | 0 |
| 319.5 | 0 |
| 319.0 | 0 |
| 318.5 | 0 |
| 318.0 | 0 |
| 317.5 | 0 |
| 317.0 | 0 |
| 316.5 | 0 |
| 316.0 | 0 |
| 315.5 | 0 |
| 315.0 | 0 |
| 314.5 | 0 |
| 314.0 | 0 |
| 313.5 | 0 |
| 313.0 | 0 |
| 312.5 | 0 |
| 312.0 | 0 |
| 311.5 | 0 |
| 311.0 | 0 |
| 310.5 | 0 |
| 310.0 | 0 |
| 309.5 | 0 |
| 309.0 | 0 |
| 308.5 | 0 |
| 308.0 | 0 |
| 307.5 | 0 |
| 307.0 | 0 |
| 306.5 | 0 |
| 306.0 | 0 |
| 305.5 | 0 |
| 305.0 | 0 |
| 304.5 | 0 |
| 304.0 | 0 |
| 303.5 | 0 |
| 303.0 | 0 |
| 302.5 | 0 |
| 302.0 | 0 |
| 301.5 | 0 |
| 301.0 | 0 |
| 300.5 | 0 |
| 300.0 | 0 |